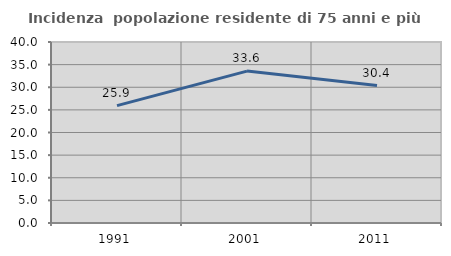
| Category | Incidenza  popolazione residente di 75 anni e più |
|---|---|
| 1991.0 | 25.946 |
| 2001.0 | 33.566 |
| 2011.0 | 30.38 |